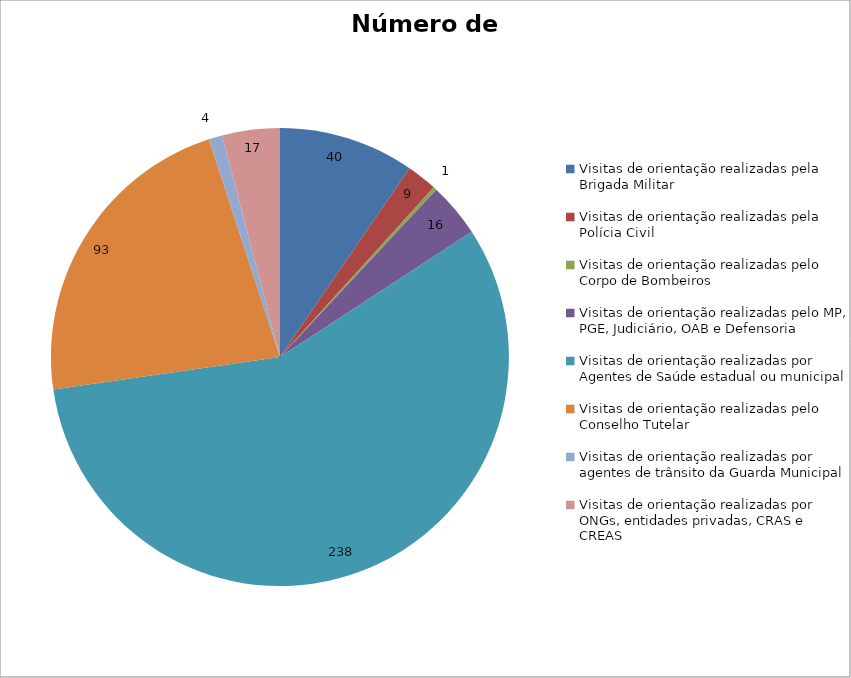
| Category | Número de Ações |
|---|---|
| Visitas de orientação realizadas pela Brigada Militar | 40 |
| Visitas de orientação realizadas pela Polícia Civil | 9 |
| Visitas de orientação realizadas pelo Corpo de Bombeiros | 1 |
| Visitas de orientação realizadas pelo MP, PGE, Judiciário, OAB e Defensoria | 16 |
| Visitas de orientação realizadas por Agentes de Saúde estadual ou municipal | 238 |
| Visitas de orientação realizadas pelo Conselho Tutelar | 93 |
| Visitas de orientação realizadas por agentes de trânsito da Guarda Municipal | 4 |
| Visitas de orientação realizadas por ONGs, entidades privadas, CRAS e CREAS | 17 |